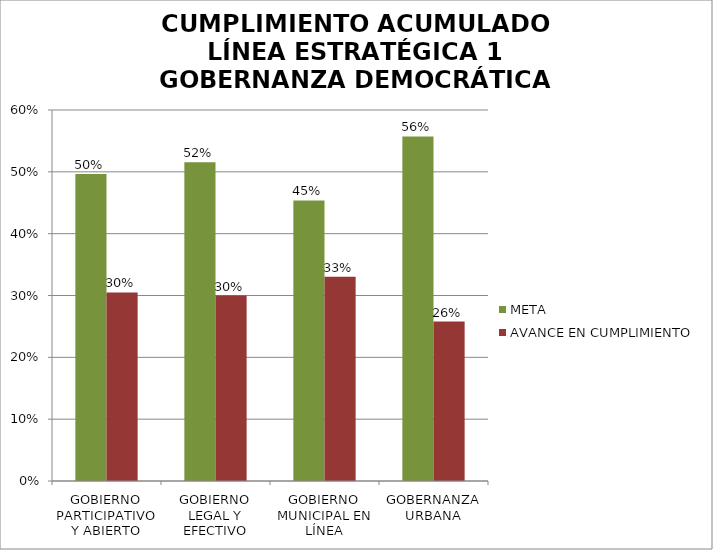
| Category | META | AVANCE EN CUMPLIMIENTO |
|---|---|---|
| GOBIERNO PARTICIPATIVO Y ABIERTO | 0.497 | 0.305 |
| GOBIERNO LEGAL Y EFECTIVO | 0.516 | 0.3 |
| GOBIERNO MUNICIPAL EN LÍNEA | 0.454 | 0.33 |
| GOBERNANZA URBANA | 0.557 | 0.258 |